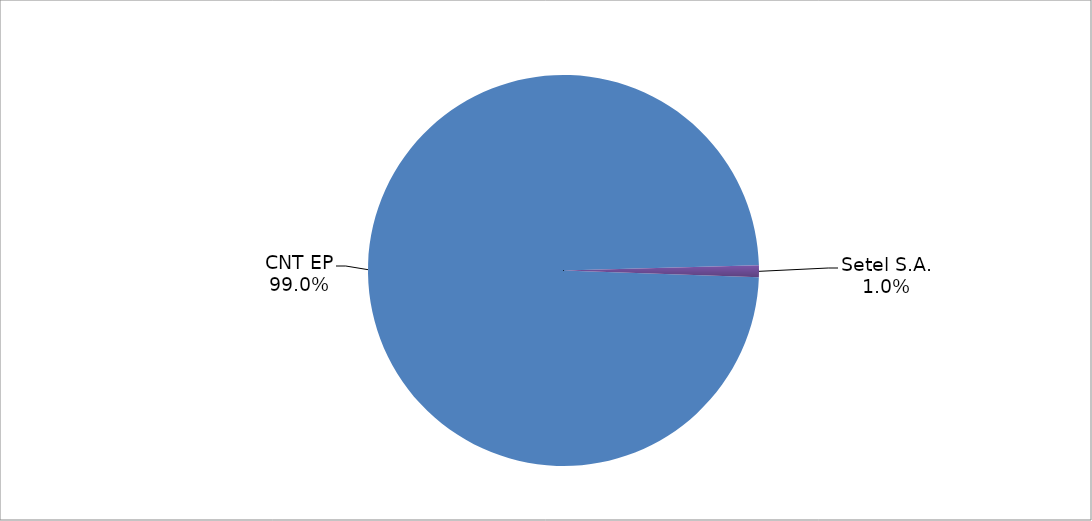
| Category | Series 0 |
|---|---|
| CNT EP | 305 |
| Setel S.A. | 3 |